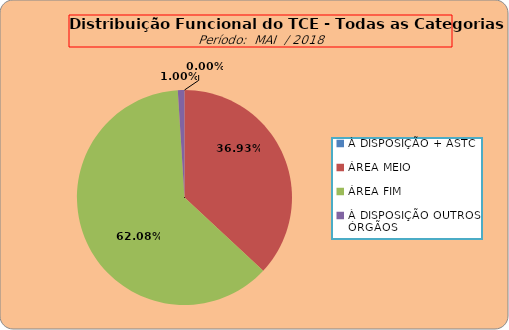
| Category | Series 0 |
|---|---|
| À DISPOSIÇÃO + ASTC | 0 |
| ÁREA MEIO | 185 |
| ÁREA FIM | 311 |
| À DISPOSIÇÃO OUTROS ÓRGÃOS | 5 |